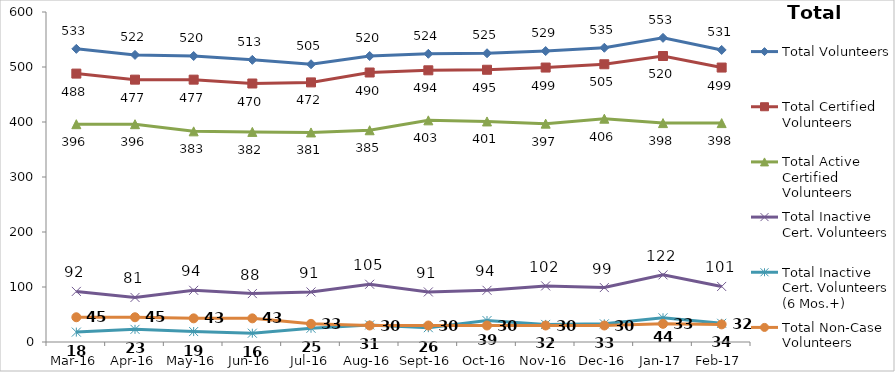
| Category | Total Volunteers | Total Certified Volunteers | Total Active Certified Volunteers | Total Inactive Cert. Volunteers | Total Inactive Cert. Volunteers (6 Mos.+) | Total Non-Case Volunteers |
|---|---|---|---|---|---|---|
| Mar-16 | 533 | 488 | 396 | 92 | 18 | 45 |
| Apr-16 | 522 | 477 | 396 | 81 | 23 | 45 |
| May-16 | 520 | 477 | 383 | 94 | 19 | 43 |
| Jun-16 | 513 | 470 | 382 | 88 | 16 | 43 |
| Jul-16 | 505 | 472 | 381 | 91 | 25 | 33 |
| Aug-16 | 520 | 490 | 385 | 105 | 31 | 30 |
| Sep-16 | 524 | 494 | 403 | 91 | 26 | 30 |
| Oct-16 | 525 | 495 | 401 | 94 | 39 | 30 |
| Nov-16 | 529 | 499 | 397 | 102 | 32 | 30 |
| Dec-16 | 535 | 505 | 406 | 99 | 33 | 30 |
| Jan-17 | 553 | 520 | 398 | 122 | 44 | 33 |
| Feb-17 | 531 | 499 | 398 | 101 | 34 | 32 |